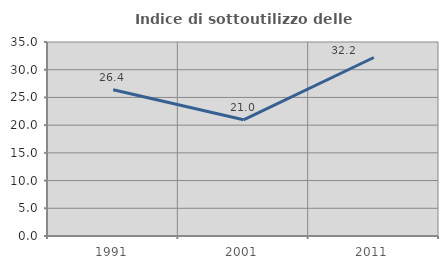
| Category | Indice di sottoutilizzo delle abitazioni  |
|---|---|
| 1991.0 | 26.374 |
| 2001.0 | 20.968 |
| 2011.0 | 32.203 |